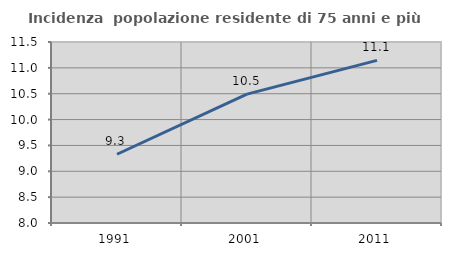
| Category | Incidenza  popolazione residente di 75 anni e più |
|---|---|
| 1991.0 | 9.33 |
| 2001.0 | 10.493 |
| 2011.0 | 11.145 |